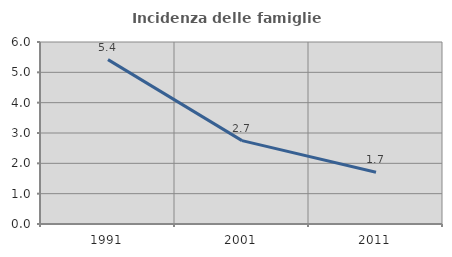
| Category | Incidenza delle famiglie numerose |
|---|---|
| 1991.0 | 5.419 |
| 2001.0 | 2.749 |
| 2011.0 | 1.708 |